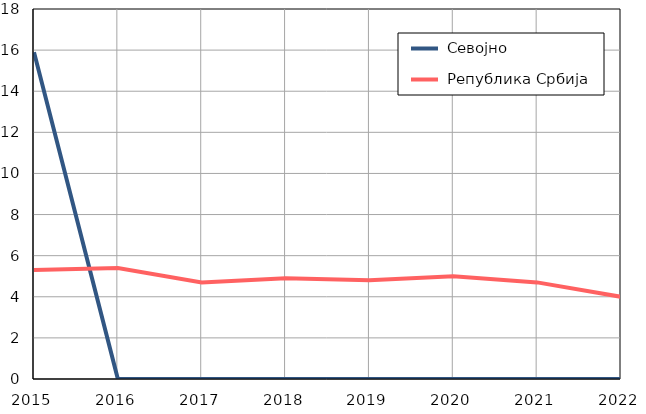
| Category |  Севојно |  Република Србија |
|---|---|---|
| 2015.0 | 15.9 | 5.3 |
| 2016.0 | 0 | 5.4 |
| 2017.0 | 0 | 4.7 |
| 2018.0 | 0 | 4.9 |
| 2019.0 | 0 | 4.8 |
| 2020.0 | 0 | 5 |
| 2021.0 | 0 | 4.7 |
| 2022.0 | 0 | 4 |